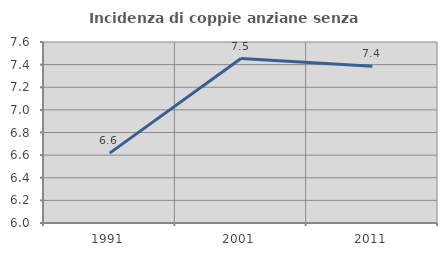
| Category | Incidenza di coppie anziane senza figli  |
|---|---|
| 1991.0 | 6.618 |
| 2001.0 | 7.453 |
| 2011.0 | 7.386 |